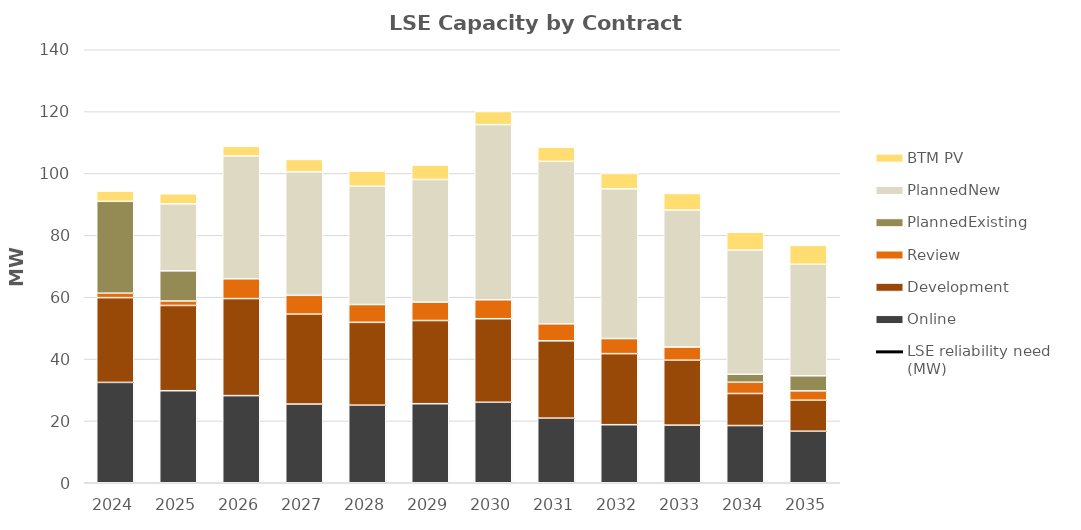
| Category | Online | Development | Review | PlannedExisting | PlannedNew | BTM PV |
|---|---|---|---|---|---|---|
| 2024.0 | 32.445 | 27.409 | 1.441 | 29.698 | 0 | 3.305 |
| 2025.0 | 29.758 | 27.566 | 1.443 | 9.744 | 21.671 | 3.235 |
| 2026.0 | 28.177 | 31.376 | 6.404 | 0 | 39.676 | 3.133 |
| 2027.0 | 25.441 | 29.075 | 6.083 | 0 | 39.957 | 3.976 |
| 2028.0 | 25.089 | 26.775 | 5.761 | 0 | 38.254 | 4.908 |
| 2029.0 | 25.553 | 26.898 | 5.944 | 0 | 39.649 | 4.602 |
| 2030.0 | 26.018 | 27.022 | 6.127 | 0 | 56.643 | 4.224 |
| 2031.0 | 20.89 | 24.997 | 5.505 | 0 | 52.526 | 4.592 |
| 2032.0 | 18.773 | 22.972 | 4.884 | 0 | 48.408 | 4.973 |
| 2033.0 | 18.636 | 20.988 | 4.262 | 0 | 44.291 | 5.353 |
| 2034.0 | 18.499 | 10.358 | 3.64 | 2.579 | 40.173 | 5.736 |
| 2035.0 | 16.666 | 10.019 | 3.018 | 4.886 | 36.055 | 6.114 |